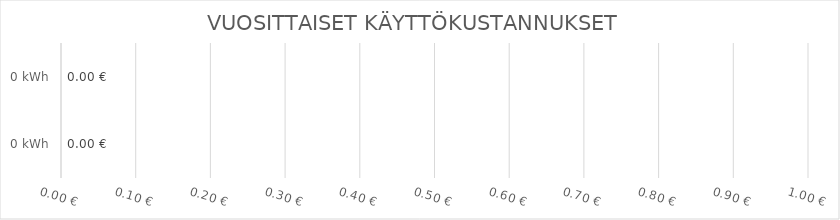
| Category | VUOSITTAISET ENERGIAKUSTANNUKSET €/KWH  |
|---|---|
| 0.0 | 0 |
| 0.0 | 0 |